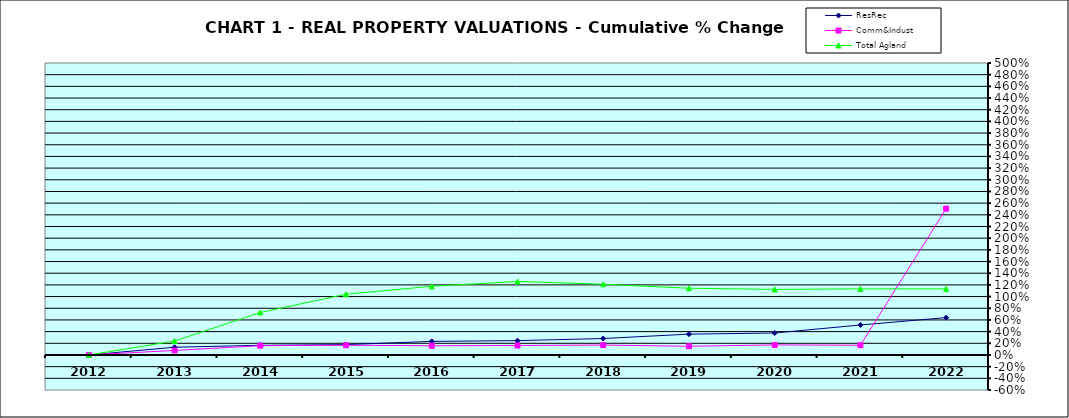
| Category | ResRec | Comm&Indust | Total Agland |
|---|---|---|---|
| 2012.0 | 0 | 0 | 0 |
| 2013.0 | 0.132 | 0.077 | 0.238 |
| 2014.0 | 0.165 | 0.159 | 0.727 |
| 2015.0 | 0.177 | 0.167 | 1.041 |
| 2016.0 | 0.233 | 0.158 | 1.176 |
| 2017.0 | 0.246 | 0.162 | 1.259 |
| 2018.0 | 0.282 | 0.17 | 1.212 |
| 2019.0 | 0.357 | 0.149 | 1.143 |
| 2020.0 | 0.376 | 0.172 | 1.123 |
| 2021.0 | 0.513 | 0.167 | 1.132 |
| 2022.0 | 0.639 | 2.506 | 1.131 |